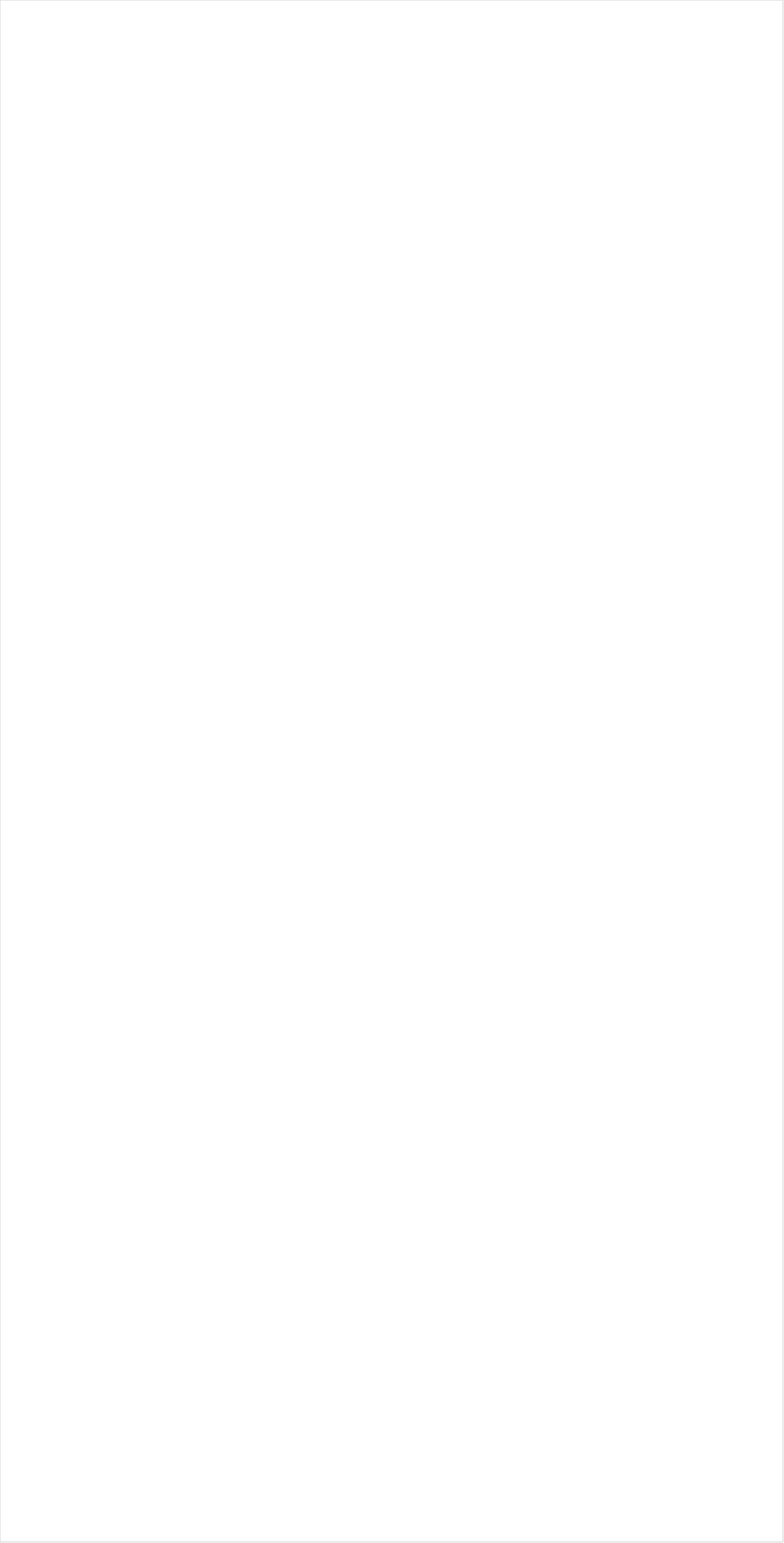
| Category | Total |
|---|---|
| TUDN | -0.926 |
| Galavision | -0.921 |
| Univision | -0.914 |
| Telemundo | -0.896 |
| NBC Universo | -0.873 |
| UniMas | -0.871 |
| BET | -0.746 |
| BET Her | -0.728 |
| VH1 | -0.678 |
| TV ONE | -0.622 |
| MTV2 | -0.606 |
| Cartoon Network | -0.555 |
| Teen Nick | -0.551 |
| NBA TV | -0.497 |
| Disney Channel | -0.446 |
| Oprah Winfrey Network | -0.417 |
| Adult Swim | -0.412 |
| Nick | -0.405 |
| Nick Jr. | -0.396 |
| MSNBC | -0.388 |
| Tennis Channel | -0.369 |
| Nick Toons | -0.363 |
| Lifetime Movies | -0.356 |
| Nick@Nite | -0.33 |
| CNN | -0.323 |
| Disney Junior US | -0.307 |
| ESPN Deportes | -0.303 |
| Logo | -0.301 |
| BRAVO | -0.278 |
| Disney XD | -0.278 |
| Discovery Life Channel | -0.258 |
| TLC | -0.236 |
| E! | -0.205 |
| Lifetime | -0.195 |
| WE TV | -0.163 |
| ESPN2 | -0.135 |
| MTV | -0.093 |
| Universal Kids | -0.073 |
| Freeform | -0.072 |
| Comedy Central | -0.067 |
| FXX | -0.067 |
| HGTV | -0.022 |
| FX | -0.016 |
| Hallmark Movies & Mysteries | 0.001 |
| ESPN | 0.013 |
| TNT | 0.029 |
| Investigation Discovery | 0.03 |
| truTV | 0.036 |
| Hallmark | 0.037 |
| SYFY | 0.038 |
| CW | 0.053 |
| MyNetworkTV | 0.055 |
| OXYGEN | 0.057 |
| ION | 0.064 |
| FX Movie Channel | 0.069 |
| Golf | 0.074 |
| Discovery Family Channel | 0.076 |
| Bloomberg HD | 0.082 |
| UP TV | 0.089 |
| PBS | 0.116 |
| USA Network | 0.116 |
| TBS | 0.132 |
| Game Show | 0.138 |
| Headline News | 0.146 |
| CNBC | 0.146 |
| BBC America | 0.158 |
| ABC | 0.172 |
| Food Network | 0.178 |
| Travel | 0.18 |
| Paramount Network | 0.229 |
| NBC | 0.243 |
| Cooking Channel | 0.247 |
| POP | 0.259 |
| AMC | 0.26 |
| NFL Network | 0.283 |
| Olympic Channel | 0.307 |
| Ovation | 0.323 |
| TV LAND | 0.344 |
| Reelz Channel | 0.353 |
| CMTV | 0.359 |
| Viceland | 0.359 |
| PAC-12 Network | 0.367 |
| CBS | 0.369 |
| Fox Business | 0.42 |
| National Geographic Wild | 0.454 |
| FOX | 0.464 |
| Fox News | 0.482 |
| MLB Network | 0.483 |
| A&E | 0.489 |
| Independent Film (IFC) | 0.494 |
| Big Ten Network | 0.542 |
| DIY | 0.555 |
| Great American Country | 0.559 |
| WGN America | 0.574 |
| American Heroes Channel | 0.577 |
| ESPNEWS | 0.58 |
| ESPNU | 0.595 |
| NHL | 0.618 |
| INSP | 0.658 |
| Smithsonian | 0.67 |
| SundanceTV | 0.683 |
| Animal Planet | 0.717 |
| Science Channel | 0.739 |
| History Channel | 0.75 |
| National Geographic | 0.777 |
| Destination America | 0.778 |
| Discovery Channel | 0.908 |
| FXDEP | 0.912 |
| FYI | 0.924 |
| NBC Sports | 0.926 |
| Weather Channel | 1.218 |
| The Sportsman Channel | 1.287 |
| Outdoor Channel | 1.379 |
| RFD TV | 1.5 |
| Motor Trend Network | 1.562 |
| Fox Sports 1 | 1.588 |
| CBS Sports | 2.291 |
| FOX Sports 2 | 4.416 |